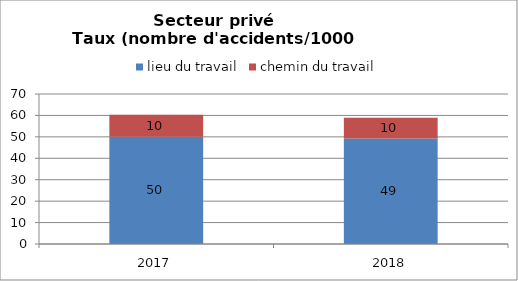
| Category | lieu du travail | chemin du travail |
|---|---|---|
| 2017.0 | 50.092 | 10.203 |
| 2018.0 | 49.184 | 9.774 |